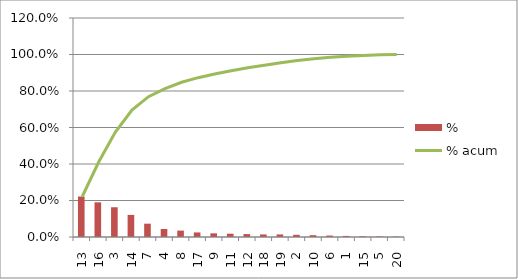
| Category | % |
|---|---|
| 13.0 | 0.222 |
| 16.0 | 0.19 |
| 3.0 | 0.163 |
| 14.0 | 0.121 |
| 7.0 | 0.073 |
| 4.0 | 0.044 |
| 8.0 | 0.035 |
| 17.0 | 0.025 |
| 9.0 | 0.02 |
| 11.0 | 0.018 |
| 12.0 | 0.016 |
| 18.0 | 0.014 |
| 19.0 | 0.014 |
| 2.0 | 0.012 |
| 10.0 | 0.01 |
| 6.0 | 0.008 |
| 1.0 | 0.006 |
| 15.0 | 0.004 |
| 5.0 | 0.003 |
| 20.0 | 0.002 |